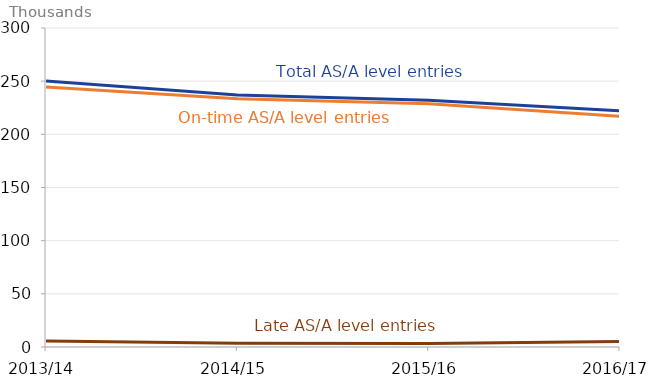
| Category | Total Entries | On-time entries | Late entries |
|---|---|---|---|
| 2013/14 | 250235 | 244545 | 5690 |
| 2014/15 | 236910 | 233445 | 3465 |
| 2015/16 | 232125 | 228875 | 3250 |
| 2016/17 | 222125 | 217000 | 5130 |